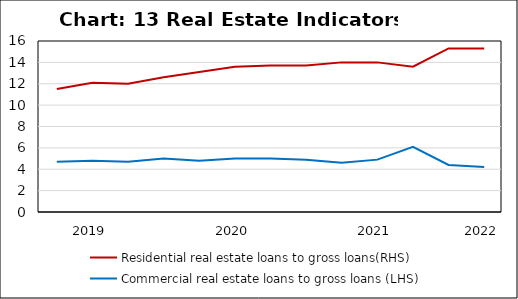
| Category | Residential real estate loans to gross loans(RHS) | Commercial real estate loans to gross loans (LHS) |
|---|---|---|
| nan | 11.5 | 4.7 |
| 2019.0 | 12.1 | 4.8 |
| nan | 12 | 4.7 |
| nan | 12.6 | 5 |
| nan | 13.1 | 4.8 |
| 2020.0 | 13.6 | 5 |
| nan | 13.7 | 5 |
| nan | 13.7 | 4.9 |
| nan | 14 | 4.6 |
| 2021.0 | 14 | 4.9 |
| nan | 13.6 | 6.1 |
| nan | 15.3 | 4.4 |
| 2022.0 | 15.3 | 4.2 |